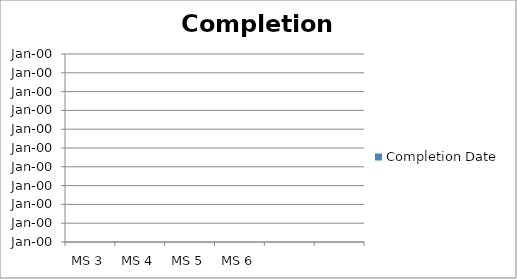
| Category | Completion Date |
|---|---|
| MS 3 | 0 |
| MS 4 | 0 |
| MS 5 | 0 |
| MS 6 | 0 |